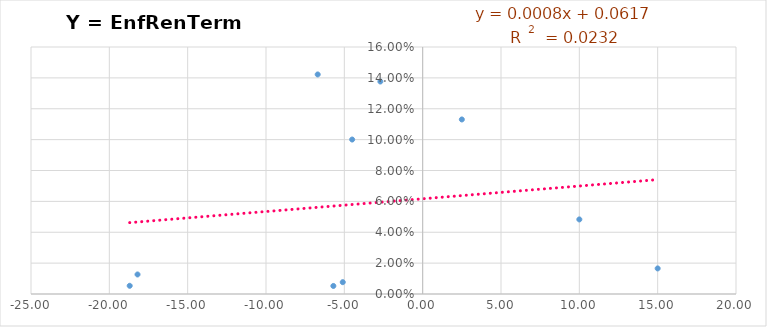
| Category | Y = EnfRenTerm /año |
|---|---|
| 10.0 | 0.048 |
| -4.5 | 0.1 |
| -6.699999999999989 | 0.142 |
| -18.69999999999999 | 0.005 |
| -18.19999999999999 | 0.013 |
| 15.0 | 0.017 |
| 2.5 | 0.113 |
| -2.6999999999999886 | 0.138 |
| -5.699999999999989 | 0.005 |
| -5.099999999999994 | 0.008 |